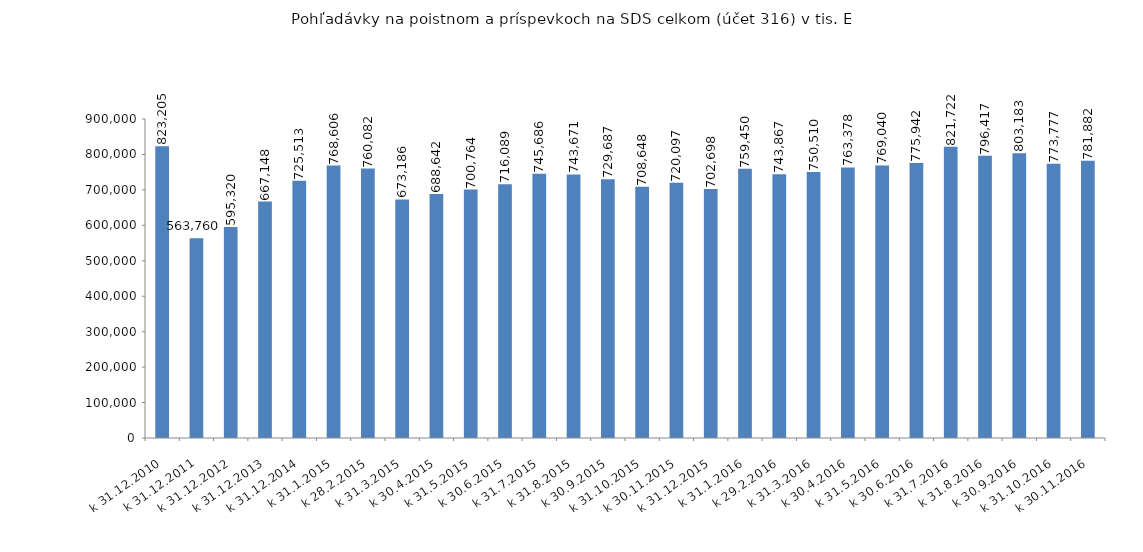
| Category | Series 0 |
|---|---|
| k 31.12.2010 | 823205 |
|  k 31.12.2011 | 563760.215 |
| k 31.12.2012 | 595319.52 |
| k 31.12.2013 | 667147.854 |
| k 31.12.2014 | 725513.4 |
| k 31.1.2015 | 768605.824 |
| k 28.2.2015 | 760081.527 |
| k 31.3.2015 | 673186.485 |
| k 30.4.2015 | 688642.112 |
| k 31.5.2015 | 700764.316 |
| k 30.6.2015 | 716089.075 |
| k 31.7.2015 | 745686.482 |
| k 31.8.2015 | 743671.164 |
| k 30.9.2015 | 729687.497 |
| k 31.10.2015 | 708647.928 |
| k 30.11.2015 | 720096.689 |
| k 31.12.2015 | 702697.806 |
| k 31.1.2016 | 759450.326 |
| k 29.2.2016 | 743867.391 |
| k 31.3.2016 | 750510.428 |
| k 30.4.2016 | 763377.861 |
| k 31.5.2016 | 769039.94 |
| k 30.6.2016 | 775941.766 |
| k 31.7.2016 | 821722.193 |
| k 31.8.2016 | 796417.363 |
| k 30.9.2016 | 803183.197 |
| k 31.10.2016 | 773776.627 |
| k 30.11.2016 | 781882.294 |